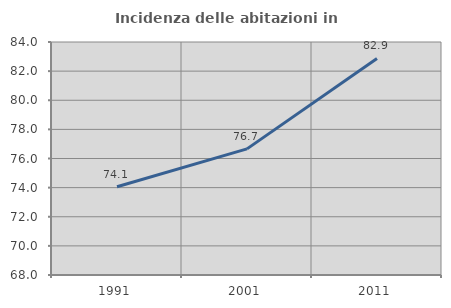
| Category | Incidenza delle abitazioni in proprietà  |
|---|---|
| 1991.0 | 74.057 |
| 2001.0 | 76.661 |
| 2011.0 | 82.868 |